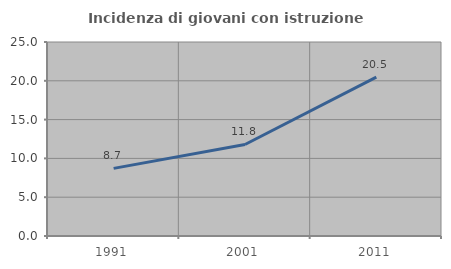
| Category | Incidenza di giovani con istruzione universitaria |
|---|---|
| 1991.0 | 8.714 |
| 2001.0 | 11.794 |
| 2011.0 | 20.481 |